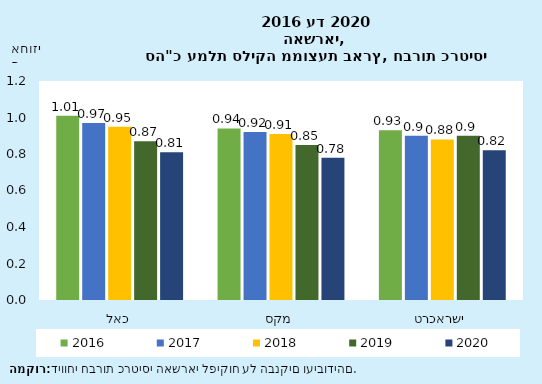
| Category | 2016 | 2017 | 2018 | 2019 | 2020 |
|---|---|---|---|---|---|
| כאל | 1.01 | 0.97 | 0.95 | 0.87 | 0.81 |
| מקס | 0.94 | 0.92 | 0.91 | 0.85 | 0.78 |
| ישראכרט | 0.93 | 0.9 | 0.88 | 0.9 | 0.82 |